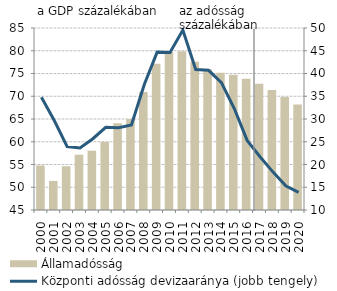
| Category | Államadósság |
|---|---|
| 2000.0 | 54.786 |
| 2001.0 | 51.382 |
| 2002.0 | 54.614 |
| 2003.0 | 57.146 |
| 2004.0 | 58.029 |
| 2005.0 | 59.954 |
| 2006.0 | 64.091 |
| 2007.0 | 64.979 |
| 2008.0 | 70.956 |
| 2009.0 | 77.149 |
| 2010.0 | 79.727 |
| 2011.0 | 79.913 |
| 2012.0 | 77.582 |
| 2013.0 | 75.955 |
| 2014.0 | 75.156 |
| 2015.0 | 74.741 |
| 2016.0 | 73.869 |
| 2017.0 | 72.768 |
| 2018.0 | 71.363 |
| 2019.0 | 69.832 |
| 2020.0 | 68.183 |